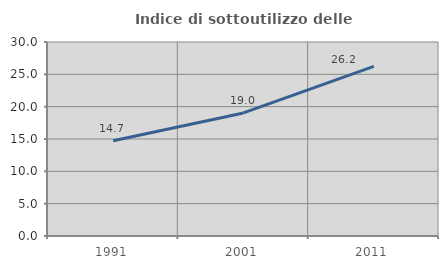
| Category | Indice di sottoutilizzo delle abitazioni  |
|---|---|
| 1991.0 | 14.723 |
| 2001.0 | 19.033 |
| 2011.0 | 26.235 |